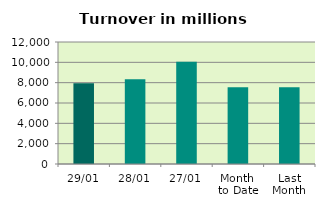
| Category | Series 0 |
|---|---|
| 29/01 | 7945.173 |
| 28/01 | 8343.108 |
| 27/01 | 10068.9 |
| Month 
to Date | 7554.603 |
| Last
Month | 7540.813 |